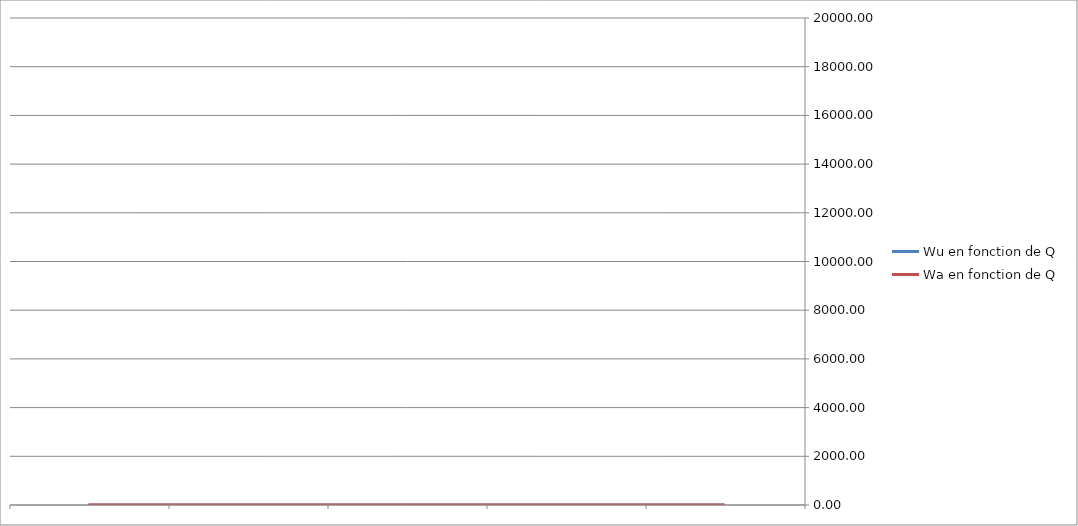
| Category | Wu en fonction de Q | Wa en fonction de Q |
|---|---|---|
|  | 0 | 0 |
|  | 0 | 0 |
|  | 0 | 0 |
|  | 0 | 0 |
|  | 0 | 0 |